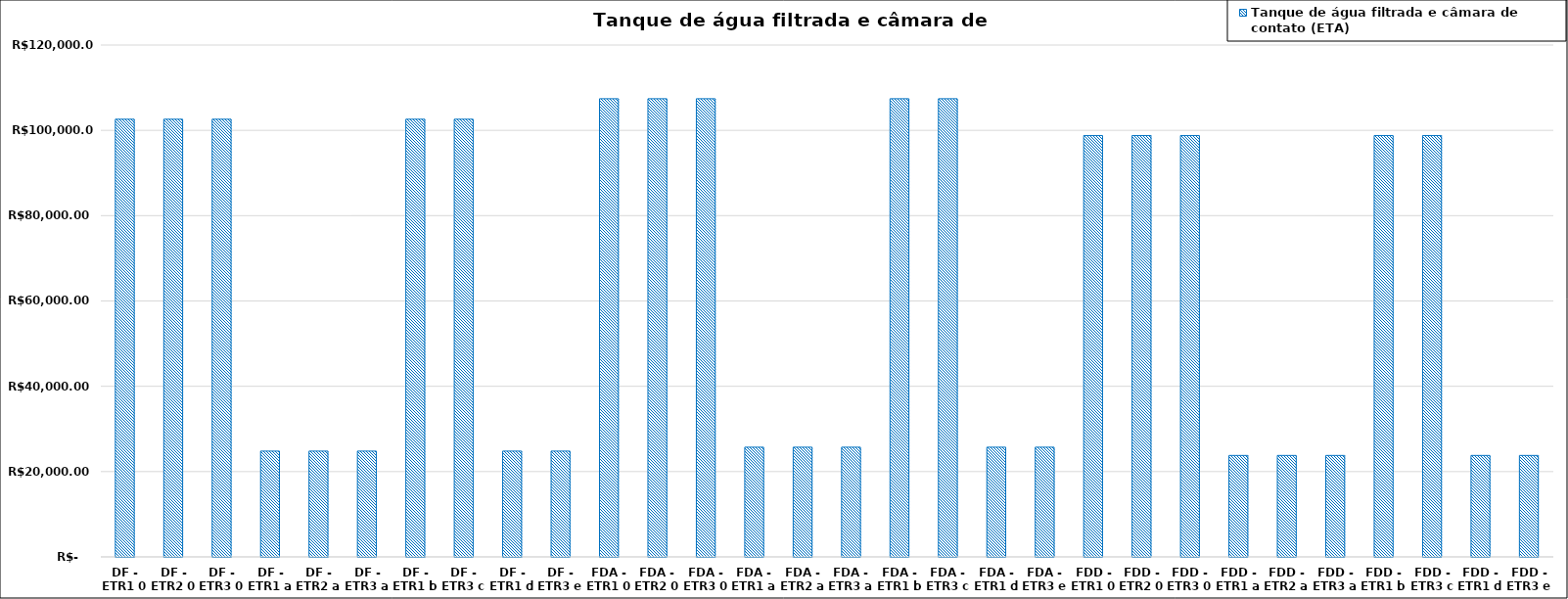
| Category | Tanque de água filtrada e câmara de contato (ETA) |
|---|---|
| DF - ETR1 0 | 102601.768 |
| DF - ETR2 0 | 102601.768 |
| DF - ETR3 0 | 102601.768 |
| DF - ETR1 a | 24804.119 |
| DF - ETR2 a | 24804.119 |
| DF - ETR3 a | 24804.119 |
| DF - ETR1 b | 102601.768 |
| DF - ETR3 c | 102601.768 |
| DF - ETR1 d | 24804.119 |
| DF - ETR3 e | 24804.119 |
| FDA - ETR1 0 | 107408.282 |
| FDA - ETR2 0 | 107408.282 |
| FDA - ETR3 0 | 107408.282 |
| FDA - ETR1 a | 25720.631 |
| FDA - ETR2 a | 25720.631 |
| FDA - ETR3 a | 25720.631 |
| FDA - ETR1 b | 107408.282 |
| FDA - ETR3 c | 107408.282 |
| FDA - ETR1 d | 25720.631 |
| FDA - ETR3 e | 25720.631 |
| FDD - ETR1 0 | 98784.112 |
| FDD - ETR2 0 | 98784.112 |
| FDD - ETR3 0 | 98784.112 |
| FDD - ETR1 a | 23783.753 |
| FDD - ETR2 a | 23783.753 |
| FDD - ETR3 a | 23783.753 |
| FDD - ETR1 b | 98784.112 |
| FDD - ETR3 c | 98784.112 |
| FDD - ETR1 d | 23783.753 |
| FDD - ETR3 e | 23783.753 |